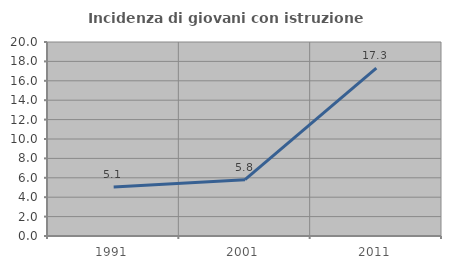
| Category | Incidenza di giovani con istruzione universitaria |
|---|---|
| 1991.0 | 5.056 |
| 2001.0 | 5.806 |
| 2011.0 | 17.308 |